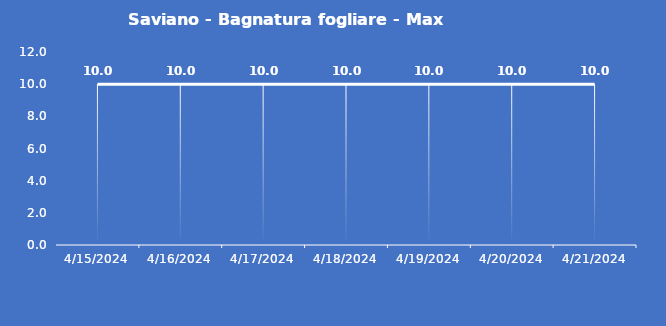
| Category | Saviano - Bagnatura fogliare - Max (min) |
|---|---|
| 4/15/24 | 10 |
| 4/16/24 | 10 |
| 4/17/24 | 10 |
| 4/18/24 | 10 |
| 4/19/24 | 10 |
| 4/20/24 | 10 |
| 4/21/24 | 10 |